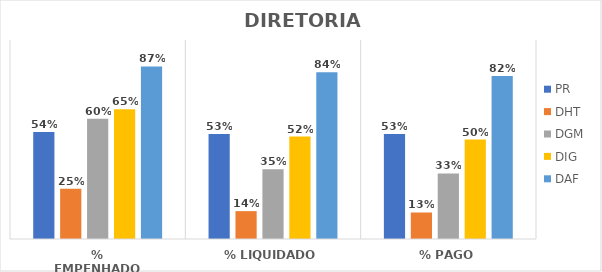
| Category | PR | DHT | DGM | DIG | DAF |
|---|---|---|---|---|---|
| % EMPENHADO | 0.538 | 0.253 | 0.604 | 0.652 | 0.867 |
| % LIQUIDADO | 0.527 | 0.14 | 0.35 | 0.515 | 0.838 |
| % PAGO | 0.527 | 0.133 | 0.33 | 0.5 | 0.82 |